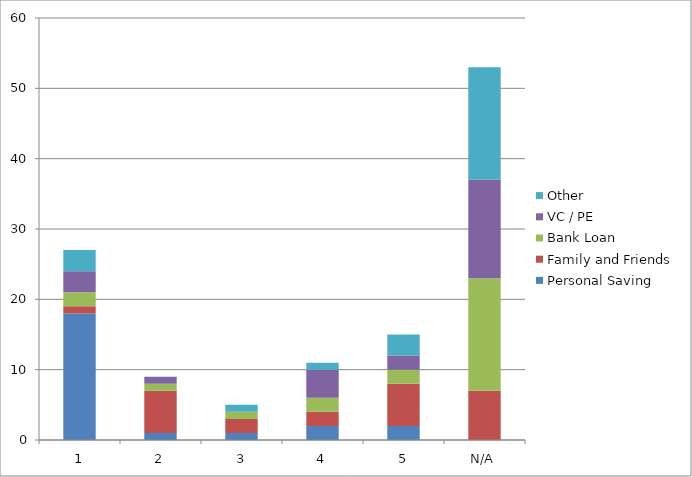
| Category | Personal Saving | Family and Friends | Bank Loan | VC / PE | Other |
|---|---|---|---|---|---|
| 1 | 18 | 1 | 2 | 3 | 3 |
| 2 | 1 | 6 | 1 | 1 | 0 |
| 3 | 1 | 2 | 1 | 0 | 1 |
| 4 | 2 | 2 | 2 | 4 | 1 |
| 5 | 2 | 6 | 2 | 2 | 3 |
| N/A | 0 | 7 | 16 | 14 | 16 |